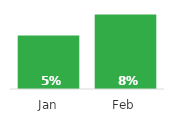
| Category | Cycle Time |
|---|---|
| Jan | 0.054 |
| Feb | 0.076 |